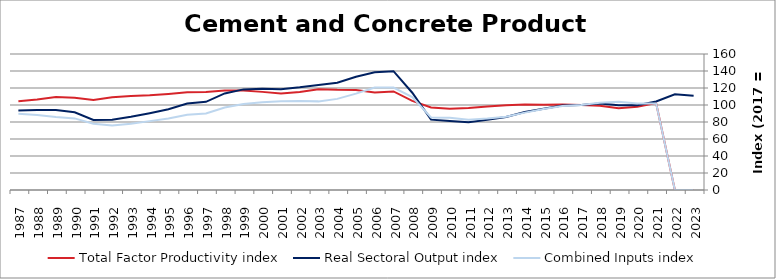
| Category | Total Factor Productivity index | Real Sectoral Output index | Combined Inputs index |
|---|---|---|---|
| 2023.0 | 0 | 110.903 | 0 |
| 2022.0 | 0 | 112.519 | 0 |
| 2021.0 | 102.207 | 104.13 | 101.881 |
| 2020.0 | 97.909 | 99.65 | 101.778 |
| 2019.0 | 96.126 | 99.695 | 103.713 |
| 2018.0 | 99.018 | 101.676 | 102.684 |
| 2017.0 | 100 | 100 | 100 |
| 2016.0 | 100.631 | 99.466 | 98.842 |
| 2015.0 | 100.149 | 95.547 | 95.404 |
| 2014.0 | 100.727 | 91.7 | 91.038 |
| 2013.0 | 99.627 | 85.94 | 86.261 |
| 2012.0 | 98.219 | 82.606 | 84.104 |
| 2011.0 | 96.502 | 79.686 | 82.574 |
| 2010.0 | 95.596 | 81.178 | 84.918 |
| 2009.0 | 97.032 | 82.752 | 85.283 |
| 2008.0 | 104.805 | 114.448 | 109.2 |
| 2007.0 | 115.968 | 139.755 | 120.511 |
| 2006.0 | 114.829 | 138.407 | 120.534 |
| 2005.0 | 117.609 | 133.298 | 113.34 |
| 2004.0 | 117.8 | 126.273 | 107.192 |
| 2003.0 | 118.591 | 123.649 | 104.265 |
| 2002.0 | 115.409 | 120.807 | 104.677 |
| 2001.0 | 113.482 | 118.462 | 104.388 |
| 2000.0 | 115.445 | 119.077 | 103.147 |
| 1999.0 | 117.097 | 118.362 | 101.081 |
| 1998.0 | 117.002 | 113.583 | 97.078 |
| 1997.0 | 115.324 | 103.721 | 89.939 |
| 1996.0 | 114.992 | 101.719 | 88.457 |
| 1995.0 | 113.072 | 94.992 | 84.01 |
| 1994.0 | 111.507 | 90.351 | 81.027 |
| 1993.0 | 110.524 | 86.117 | 77.917 |
| 1992.0 | 109.048 | 82.766 | 75.898 |
| 1991.0 | 105.829 | 82.383 | 77.846 |
| 1990.0 | 108.496 | 91.406 | 84.248 |
| 1989.0 | 109.45 | 94.059 | 85.937 |
| 1988.0 | 106.515 | 93.976 | 88.228 |
| 1987.0 | 104.43 | 93.551 | 89.583 |